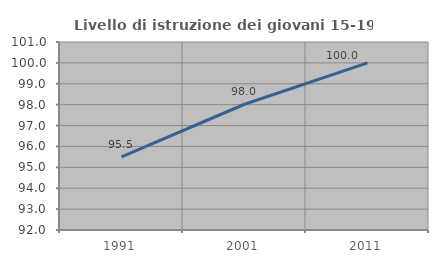
| Category | Livello di istruzione dei giovani 15-19 anni |
|---|---|
| 1991.0 | 95.495 |
| 2001.0 | 98.02 |
| 2011.0 | 100 |